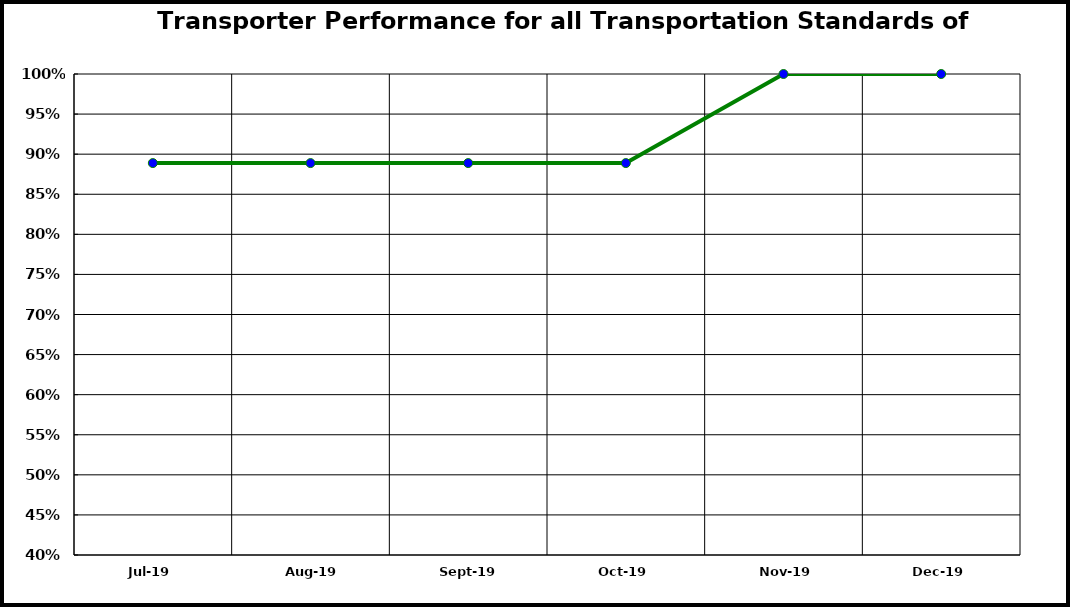
| Category | Performance |
|---|---|
| 2019-07-01 | 0.889 |
| 2019-08-01 | 0.889 |
| 2019-09-01 | 0.889 |
| 2019-10-01 | 0.889 |
| 2019-11-01 | 1 |
| 2019-12-01 | 1 |